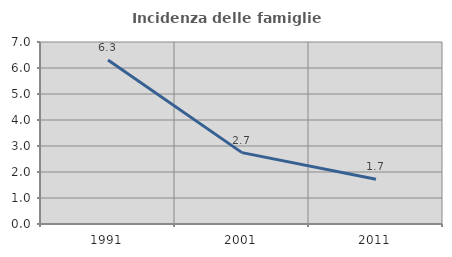
| Category | Incidenza delle famiglie numerose |
|---|---|
| 1991.0 | 6.307 |
| 2001.0 | 2.746 |
| 2011.0 | 1.72 |